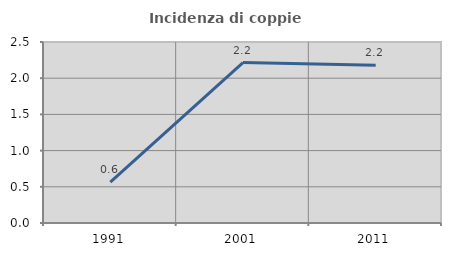
| Category | Incidenza di coppie miste |
|---|---|
| 1991.0 | 0.566 |
| 2001.0 | 2.215 |
| 2011.0 | 2.18 |